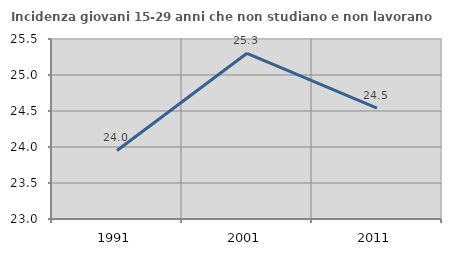
| Category | Incidenza giovani 15-29 anni che non studiano e non lavorano  |
|---|---|
| 1991.0 | 23.952 |
| 2001.0 | 25.301 |
| 2011.0 | 24.54 |